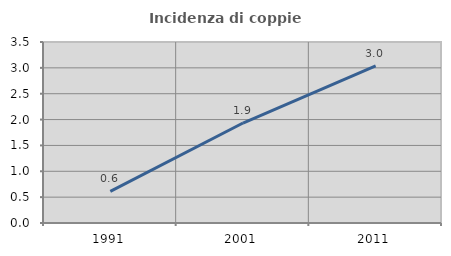
| Category | Incidenza di coppie miste |
|---|---|
| 1991.0 | 0.611 |
| 2001.0 | 1.933 |
| 2011.0 | 3.04 |